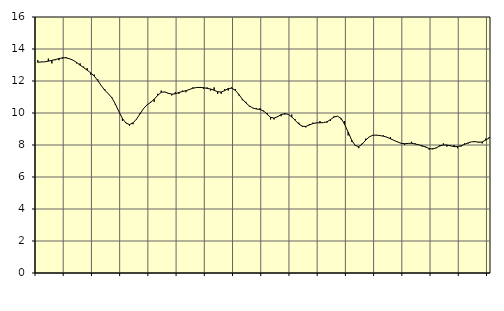
| Category | Piggar | Tillverkning av verkstadsvaror, SNI 25-30, 33 |
|---|---|---|
| nan | 13.3 | 13.17 |
| 87.0 | 13.2 | 13.19 |
| 87.0 | 13.2 | 13.2 |
| 87.0 | 13.4 | 13.24 |
| nan | 13.1 | 13.29 |
| 88.0 | 13.3 | 13.34 |
| 88.0 | 13.3 | 13.4 |
| 88.0 | 13.4 | 13.45 |
| nan | 13.5 | 13.45 |
| 89.0 | 13.4 | 13.39 |
| 89.0 | 13.3 | 13.3 |
| 89.0 | 13.1 | 13.16 |
| nan | 13.1 | 12.99 |
| 90.0 | 12.9 | 12.84 |
| 90.0 | 12.8 | 12.68 |
| 90.0 | 12.4 | 12.51 |
| nan | 12.4 | 12.31 |
| 91.0 | 12.1 | 12.03 |
| 91.0 | 11.7 | 11.71 |
| 91.0 | 11.5 | 11.42 |
| nan | 11.2 | 11.21 |
| 92.0 | 11 | 10.95 |
| 92.0 | 10.5 | 10.56 |
| 92.0 | 10.1 | 10.09 |
| nan | 9.5 | 9.66 |
| 93.0 | 9.4 | 9.37 |
| 93.0 | 9.2 | 9.28 |
| 93.0 | 9.3 | 9.38 |
| nan | 9.6 | 9.62 |
| 94.0 | 10 | 9.95 |
| 94.0 | 10.3 | 10.28 |
| 94.0 | 10.5 | 10.51 |
| nan | 10.7 | 10.66 |
| 95.0 | 10.7 | 10.86 |
| 95.0 | 11.2 | 11.1 |
| 95.0 | 11.4 | 11.29 |
| nan | 11.3 | 11.32 |
| 96.0 | 11.2 | 11.23 |
| 96.0 | 11.1 | 11.18 |
| 96.0 | 11.3 | 11.2 |
| nan | 11.2 | 11.28 |
| 97.0 | 11.4 | 11.34 |
| 97.0 | 11.3 | 11.39 |
| 97.0 | 11.5 | 11.47 |
| nan | 11.6 | 11.55 |
| 98.0 | 11.6 | 11.59 |
| 98.0 | 11.6 | 11.6 |
| 98.0 | 11.5 | 11.58 |
| nan | 11.6 | 11.54 |
| 99.0 | 11.4 | 11.5 |
| 99.0 | 11.6 | 11.42 |
| 99.0 | 11.2 | 11.33 |
| nan | 11.2 | 11.31 |
| 0.0 | 11.5 | 11.4 |
| 0.0 | 11.4 | 11.53 |
| 0.0 | 11.6 | 11.55 |
| nan | 11.5 | 11.42 |
| 1.0 | 11.1 | 11.16 |
| 1.0 | 10.8 | 10.87 |
| 1.0 | 10.7 | 10.63 |
| nan | 10.4 | 10.44 |
| 2.0 | 10.3 | 10.31 |
| 2.0 | 10.3 | 10.25 |
| 2.0 | 10.3 | 10.22 |
| nan | 10.1 | 10.13 |
| 3.0 | 10 | 9.93 |
| 3.0 | 9.6 | 9.73 |
| 3.0 | 9.6 | 9.68 |
| nan | 9.8 | 9.77 |
| 4.0 | 9.8 | 9.9 |
| 4.0 | 9.9 | 9.96 |
| 4.0 | 9.9 | 9.92 |
| nan | 9.9 | 9.76 |
| 5.0 | 9.6 | 9.54 |
| 5.0 | 9.4 | 9.31 |
| 5.0 | 9.2 | 9.17 |
| nan | 9.1 | 9.16 |
| 6.0 | 9.3 | 9.25 |
| 6.0 | 9.4 | 9.34 |
| 6.0 | 9.4 | 9.38 |
| nan | 9.5 | 9.39 |
| 7.0 | 9.4 | 9.4 |
| 7.0 | 9.4 | 9.45 |
| 7.0 | 9.5 | 9.59 |
| nan | 9.8 | 9.75 |
| 8.0 | 9.8 | 9.8 |
| 8.0 | 9.6 | 9.66 |
| 8.0 | 9.5 | 9.29 |
| nan | 8.6 | 8.81 |
| 9.0 | 8.2 | 8.3 |
| 9.0 | 8 | 7.97 |
| 9.0 | 7.8 | 7.9 |
| nan | 8.1 | 8.06 |
| 10.0 | 8.4 | 8.31 |
| 10.0 | 8.5 | 8.51 |
| 10.0 | 8.6 | 8.61 |
| nan | 8.6 | 8.62 |
| 11.0 | 8.6 | 8.59 |
| 11.0 | 8.6 | 8.55 |
| 11.0 | 8.5 | 8.49 |
| nan | 8.5 | 8.39 |
| 12.0 | 8.3 | 8.29 |
| 12.0 | 8.2 | 8.19 |
| 12.0 | 8.1 | 8.11 |
| nan | 8 | 8.08 |
| 13.0 | 8.1 | 8.1 |
| 13.0 | 8.2 | 8.11 |
| 13.0 | 8.1 | 8.06 |
| nan | 8 | 8.01 |
| 14.0 | 7.9 | 7.95 |
| 14.0 | 7.9 | 7.87 |
| 14.0 | 7.7 | 7.78 |
| nan | 7.8 | 7.75 |
| 15.0 | 7.8 | 7.83 |
| 15.0 | 8 | 7.94 |
| 15.0 | 8.1 | 8 |
| nan | 7.9 | 8 |
| 16.0 | 8 | 7.95 |
| 16.0 | 8 | 7.9 |
| 16.0 | 7.8 | 7.9 |
| nan | 7.9 | 7.95 |
| 17.0 | 8.1 | 8.04 |
| 17.0 | 8.1 | 8.13 |
| 17.0 | 8.2 | 8.2 |
| nan | 8.2 | 8.21 |
| 18.0 | 8.2 | 8.17 |
| 18.0 | 8.1 | 8.19 |
| 18.0 | 8.4 | 8.31 |
| nan | 8.5 | 8.44 |